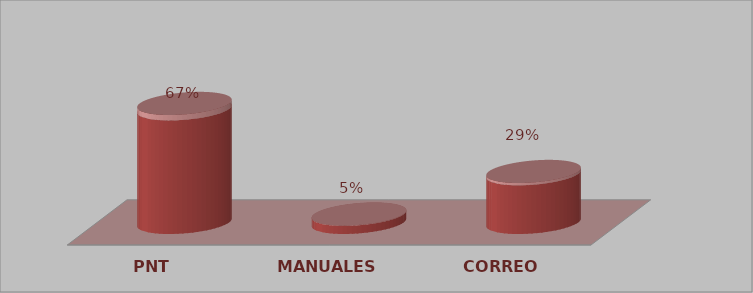
| Category | Series 0 | Series 1 |
|---|---|---|
| PNT | 14 | 0.667 |
| MANUALES | 1 | 0.048 |
| CORREO | 6 | 0.286 |